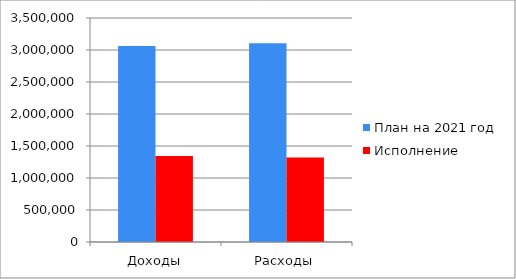
| Category | План на 2021 год | Исполнение |
|---|---|---|
| Доходы | 3064168 | 1342598 |
| Расходы | 3104985 | 1319665 |